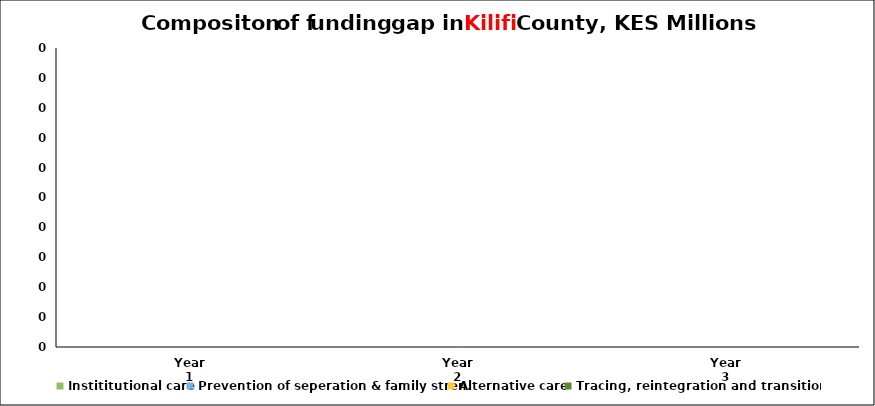
| Category | Instititutional care | Prevention of seperation & family stren. | Alternative care | Tracing, reintegration and transitioning |
|---|---|---|---|---|
| Year 1 | 0 | 0 | 0 | 0 |
| Year 2 | 0 | 0 | 0 | 0 |
| Year 3 | 0 | 0 | 0 | 0 |